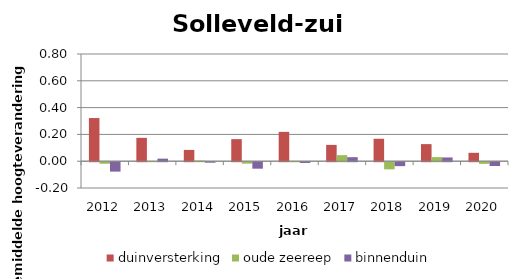
| Category | duinversterking | oude zeereep | binnenduin |
|---|---|---|---|
| 2012.0 | 0.322 | -0.012 | -0.07 |
| 2013.0 | 0.174 | 0.001 | 0.019 |
| 2014.0 | 0.084 | 0.005 | -0.004 |
| 2015.0 | 0.165 | -0.011 | -0.048 |
| 2016.0 | 0.219 | 0 | -0.006 |
| 2017.0 | 0.122 | 0.045 | 0.03 |
| 2018.0 | 0.168 | -0.053 | -0.029 |
| 2019.0 | 0.128 | 0.03 | 0.028 |
| 2020.0 | 0.063 | -0.012 | -0.028 |